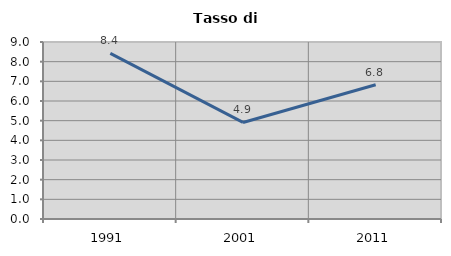
| Category | Tasso di disoccupazione   |
|---|---|
| 1991.0 | 8.419 |
| 2001.0 | 4.909 |
| 2011.0 | 6.829 |